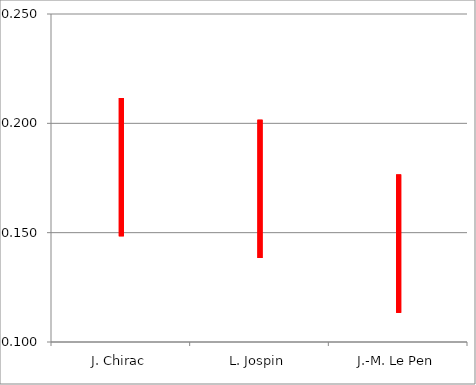
| Category | Series 0 | Series 1 | Series 2 |
|---|---|---|---|
| J. Chirac | 0.148 | 0.212 | 0.18 |
| L. Jospin | 0.138 | 0.202 | 0.17 |
| J.-M. Le Pen | 0.113 | 0.177 | 0.145 |